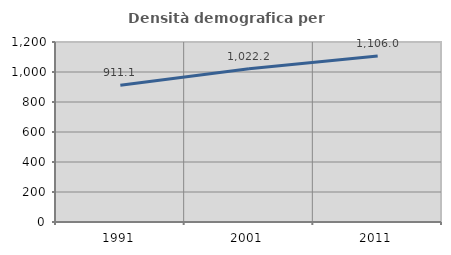
| Category | Densità demografica |
|---|---|
| 1991.0 | 911.132 |
| 2001.0 | 1022.151 |
| 2011.0 | 1105.986 |